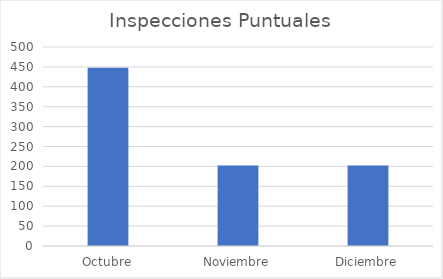
| Category | Inspecciones Puntuales |
|---|---|
| Octubre | 448 |
| Noviembre | 202 |
| Diciembre | 202 |